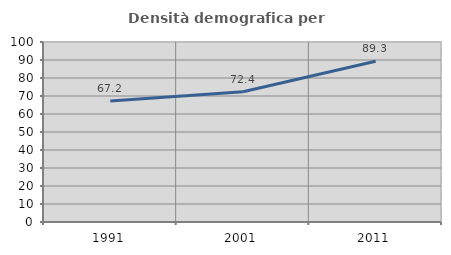
| Category | Densità demografica |
|---|---|
| 1991.0 | 67.245 |
| 2001.0 | 72.385 |
| 2011.0 | 89.279 |